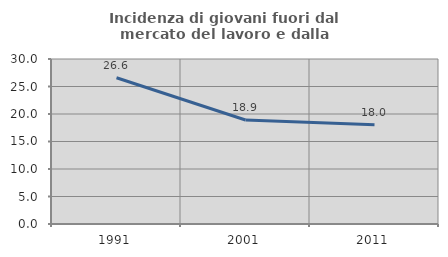
| Category | Incidenza di giovani fuori dal mercato del lavoro e dalla formazione  |
|---|---|
| 1991.0 | 26.585 |
| 2001.0 | 18.902 |
| 2011.0 | 18.045 |